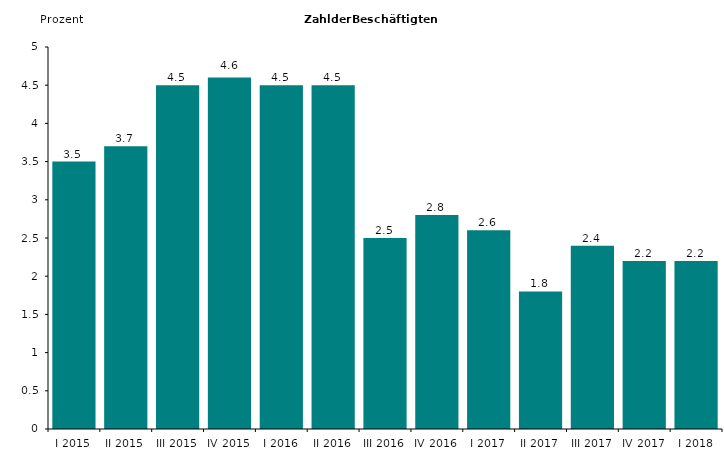
| Category | Series 0 |
|---|---|
| I 2015 | 3.5 |
| II 2015 | 3.7 |
| III 2015 | 4.5 |
| IV 2015 | 4.6 |
| I 2016 | 4.5 |
| II 2016 | 4.5 |
| III 2016 | 2.5 |
| IV 2016 | 2.8 |
| I 2017 | 2.6 |
| II 2017 | 1.8 |
| III 2017 | 2.4 |
| IV 2017 | 2.2 |
| I 2018 | 2.2 |